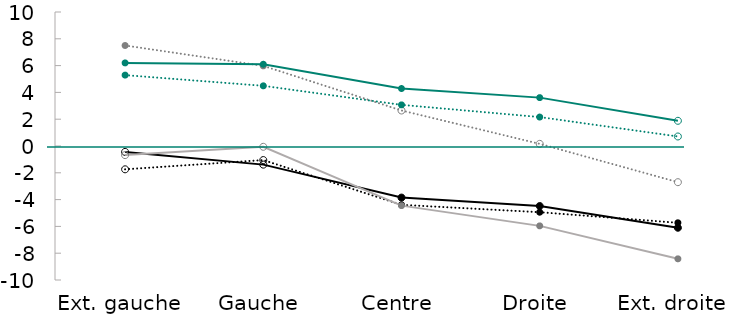
| Category | Series 0 | Series 1 | Series 2 | Series 3 | Series 4 | Series 5 |
|---|---|---|---|---|---|---|
| Ext. gauche | -0.44 | -1.74 | 7.5 | -0.68 | 5.29 | 6.2 |
| Gauche | -1.39 | -1.05 | 5.98 | -0.06 | 4.49 | 6.1 |
| Centre | -3.85 | -4.39 | 2.65 | -4.45 | 3.07 | 4.29 |
| Droite | -4.48 | -4.94 | 0.16 | -5.96 | 2.16 | 3.61 |
| Ext. droite | -6.1 | -5.73 | -2.7 | -8.42 | 0.71 | 1.88 |